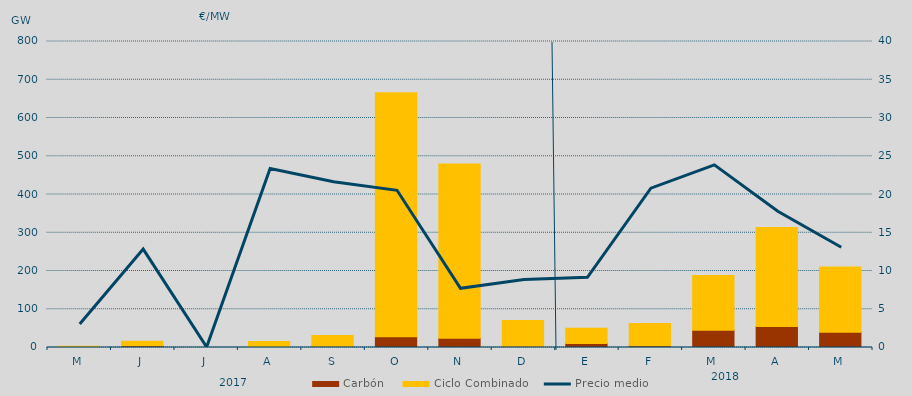
| Category | Carbón | Ciclo Combinado |
|---|---|---|
| M | 341 | 2659 |
| J | 4305 | 11713 |
| J | 0 | 0 |
| A | 0 | 15430.5 |
| S | 3306.6 | 27967.5 |
| O | 27914.4 | 638167.2 |
| N | 23926.9 | 455734.5 |
| D | 3200.6 | 67420.5 |
| E | 10696.2 | 39454.7 |
| F | 4341.9 | 58215.4 |
| M | 45246.3 | 142680.5 |
| A | 55123 | 258682.2 |
| M | 40054.5 | 170347.3 |